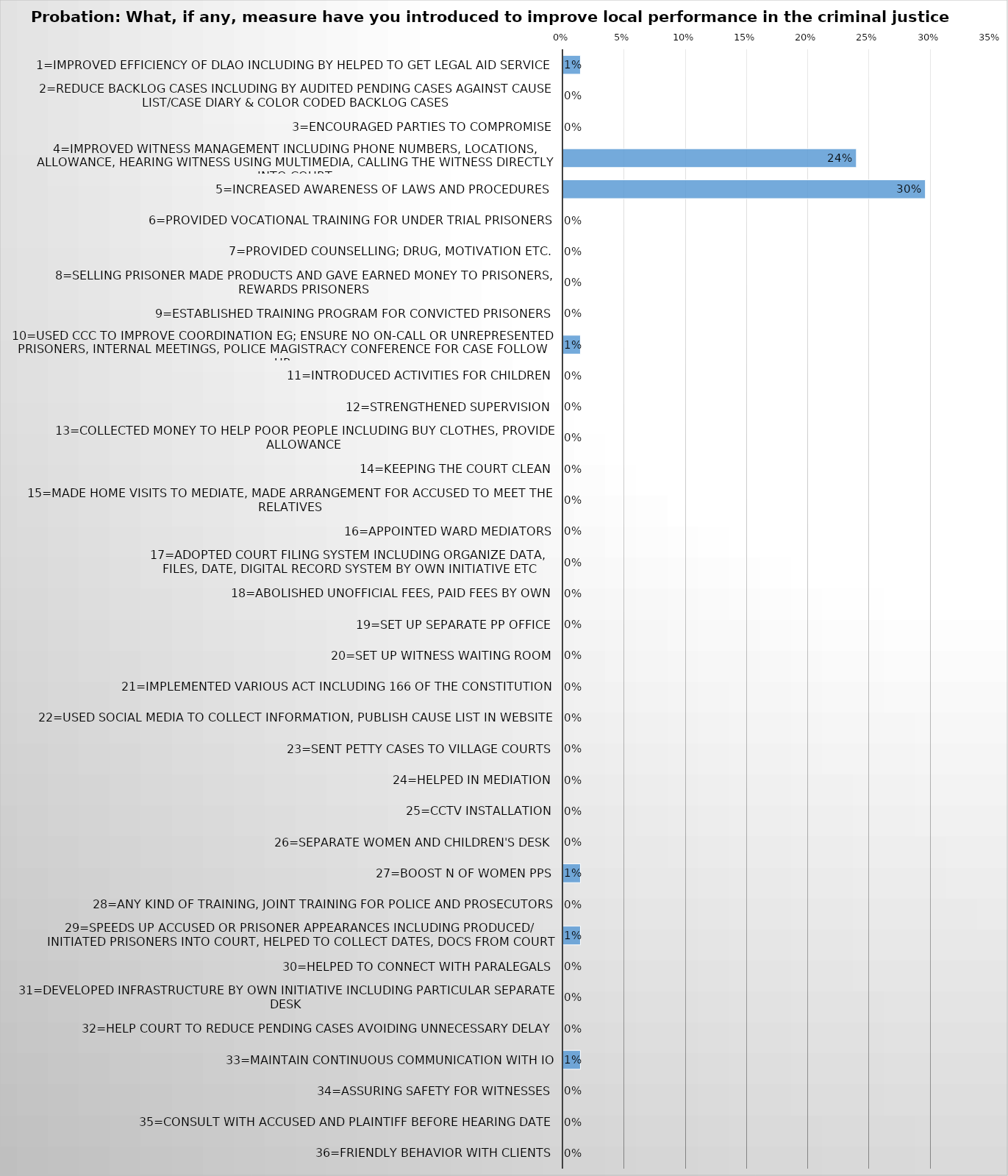
| Category | Series 0 |
|---|---|
| 1=Improved efficiency of DLAO including by helped to get legal aid service | 0.014 |
| 2=Reduce backlog cases including by audited pending cases against cause list/case diary & color coded backlog cases | 0 |
| 3=Encouraged parties to compromise | 0 |
| 4=Improved witness management including phone numbers, locations, allowance, hearing witness using multimedia, calling the witness directly into court | 0.239 |
| 5=Increased awareness of laws and procedures | 0.296 |
| 6=Provided vocational training for under trial prisoners | 0 |
| 7=Provided counselling; drug, motivation etc. | 0 |
| 8=Selling prisoner made products and gave earned money to prisoners, rewards prisoners | 0 |
| 9=Established training program for convicted prisoners | 0 |
| 10=Used CCC to improve coordination eg; ensure no on-call or unrepresented prisoners, internal meetings, police magistracy conference for case follow up | 0.014 |
| 11=Introduced activities for children | 0 |
| 12=Strengthened supervision | 0 |
| 13=Collected money to help poor people including buy clothes, provide allowance | 0 |
| 14=Keeping the court clean | 0 |
| 15=Made home visits to mediate, made arrangement for accused to meet the relatives | 0 |
| 16=Appointed ward mediators | 0 |
| 17=Adopted court filing system including organize data, 
files, date, digital record system by own initiative etc | 0 |
| 18=Abolished unofficial fees, paid fees by own | 0 |
| 19=Set up separate PP office | 0 |
| 20=Set up witness waiting room | 0 |
| 21=Implemented various act including 166 of the constitution | 0 |
| 22=Used social media to collect information, publish cause list in website | 0 |
| 23=Sent petty cases to village courts | 0 |
| 24=Helped in mediation | 0 |
| 25=CCTV installation | 0 |
| 26=Separate women and children's desk | 0 |
| 27=Boost n of women PPs | 0.014 |
| 28=Any kind of training, joint training for police and prosecutors | 0 |
| 29=Speeds up accused or prisoner appearances including produced/
initiated prisoners into court, helped to collect dates, docs from court | 0.014 |
| 30=Helped to connect with Paralegals | 0 |
| 31=Developed infrastructure by own initiative including particular separate desk | 0 |
| 32=Help court to reduce pending cases avoiding unnecessary delay | 0 |
| 33=Maintain continuous communication with IO | 0.014 |
| 34=Assuring safety for Witnesses | 0 |
| 35=Consult with accused and plaintiff before hearing date | 0 |
| 36=Friendly behavior with clients | 0 |